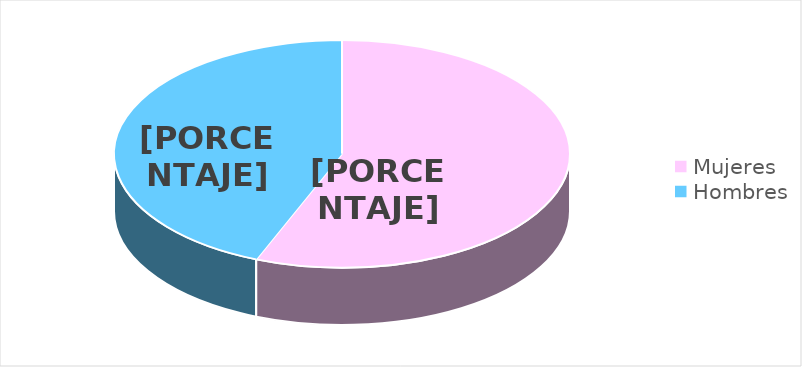
| Category | Series 0 |
|---|---|
| Mujeres | 1258 |
| Hombres | 983 |